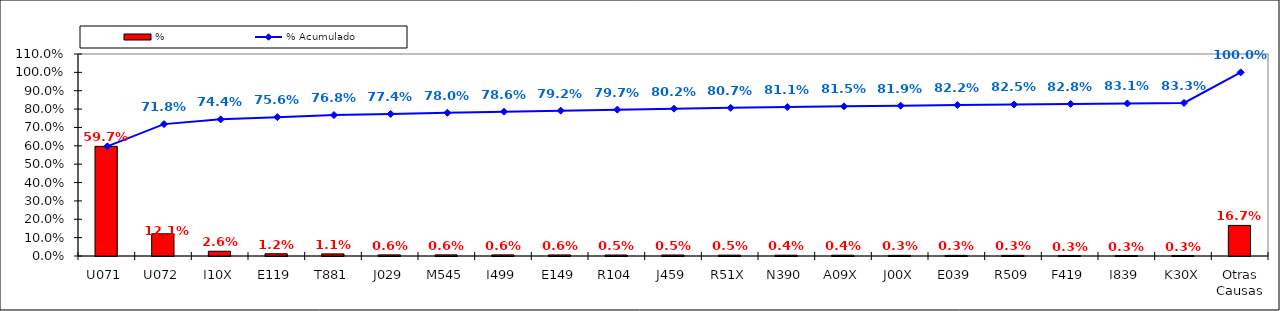
| Category | % |
|---|---|
| U071 | 0.597 |
| U072 | 0.121 |
| I10X | 0.026 |
| E119 | 0.012 |
| T881 | 0.011 |
| J029 | 0.006 |
| M545 | 0.006 |
| I499 | 0.006 |
| E149 | 0.006 |
| R104 | 0.005 |
| J459 | 0.005 |
| R51X | 0.005 |
| N390 | 0.004 |
| A09X | 0.004 |
| J00X | 0.003 |
| E039 | 0.003 |
| R509 | 0.003 |
| F419 | 0.003 |
| I839 | 0.003 |
| K30X | 0.003 |
| Otras Causas | 0.167 |